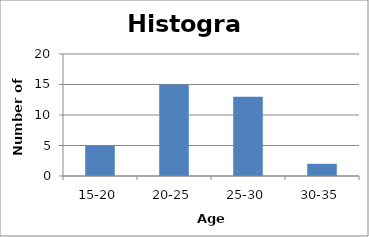
| Category | Number of people |
|---|---|
| 15-20 | 5 |
| 20-25 | 15 |
| 25-30 | 13 |
| 30-35 | 2 |